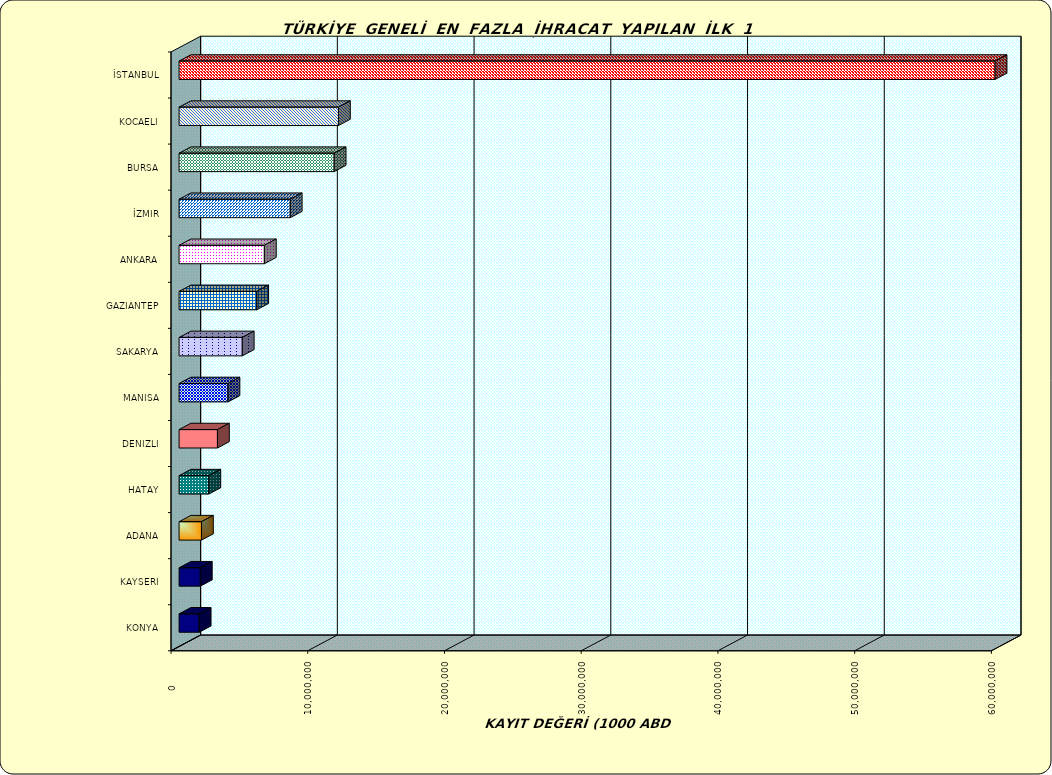
| Category | Series 0 |
|---|---|
| İSTANBUL | 59679568.396 |
| KOCAELI | 11656362.148 |
| BURSA | 11342543.273 |
| İZMIR | 8130755.018 |
| ANKARA | 6237876.8 |
| GAZIANTEP | 5679266.417 |
| SAKARYA | 4621593.862 |
| MANISA | 3577388.217 |
| DENIZLI | 2806563.459 |
| HATAY | 2177586.274 |
| ADANA | 1636921.946 |
| KAYSERI | 1552703.145 |
| KONYA | 1471592.497 |